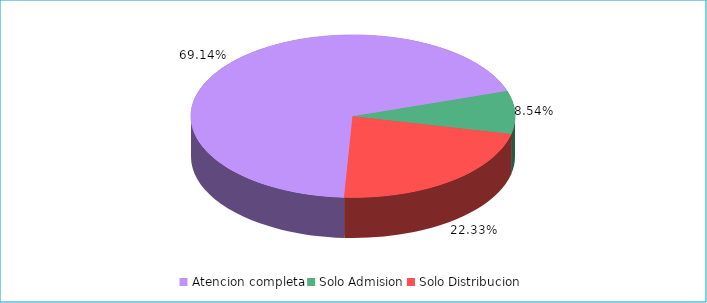
| Category | Series 0 |
|---|---|
| Atencion completa | 0.691 |
| Solo Admision | 0.085 |
| Solo Distribucion | 0.223 |